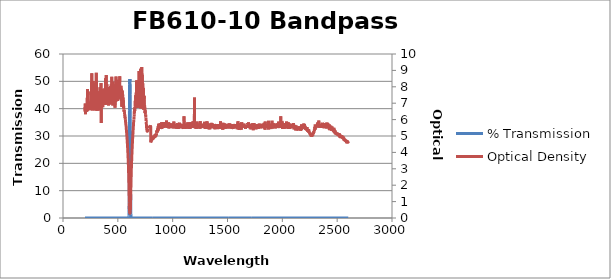
| Category | % Transmission |
|---|---|
| 2600.0 | 0.002 |
| 2599.0 | 0.002 |
| 2598.0 | 0.002 |
| 2597.0 | 0.003 |
| 2596.0 | 0.002 |
| 2595.0 | 0.002 |
| 2594.0 | 0.002 |
| 2593.0 | 0.002 |
| 2592.0 | 0.002 |
| 2591.0 | 0.002 |
| 2590.0 | 0.002 |
| 2589.0 | 0.002 |
| 2588.0 | 0.002 |
| 2587.0 | 0.002 |
| 2586.0 | 0.002 |
| 2585.0 | 0.002 |
| 2584.0 | 0.002 |
| 2583.0 | 0.002 |
| 2582.0 | 0.002 |
| 2581.0 | 0.002 |
| 2580.0 | 0.002 |
| 2579.0 | 0.002 |
| 2578.0 | 0.002 |
| 2577.0 | 0.002 |
| 2576.0 | 0.002 |
| 2575.0 | 0.002 |
| 2574.0 | 0.002 |
| 2573.0 | 0.002 |
| 2572.0 | 0.002 |
| 2571.0 | 0.002 |
| 2570.0 | 0.002 |
| 2569.0 | 0.002 |
| 2568.0 | 0.002 |
| 2567.0 | 0.002 |
| 2566.0 | 0.002 |
| 2565.0 | 0.002 |
| 2564.0 | 0.002 |
| 2563.0 | 0.001 |
| 2562.0 | 0.002 |
| 2561.0 | 0.002 |
| 2560.0 | 0.001 |
| 2559.0 | 0.001 |
| 2558.0 | 0.001 |
| 2557.0 | 0.001 |
| 2556.0 | 0.001 |
| 2555.0 | 0.002 |
| 2554.0 | 0.002 |
| 2553.0 | 0.001 |
| 2552.0 | 0.001 |
| 2551.0 | 0.001 |
| 2550.0 | 0.001 |
| 2549.0 | 0.001 |
| 2548.0 | 0.001 |
| 2547.0 | 0.001 |
| 2546.0 | 0.001 |
| 2545.0 | 0.001 |
| 2544.0 | 0.001 |
| 2543.0 | 0.001 |
| 2542.0 | 0.001 |
| 2541.0 | 0.001 |
| 2540.0 | 0.001 |
| 2539.0 | 0.001 |
| 2538.0 | 0.001 |
| 2537.0 | 0.001 |
| 2536.0 | 0.001 |
| 2535.0 | 0.001 |
| 2534.0 | 0.001 |
| 2533.0 | 0.001 |
| 2532.0 | 0.001 |
| 2531.0 | 0.001 |
| 2530.0 | 0.001 |
| 2529.0 | 0.001 |
| 2528.0 | 0.001 |
| 2527.0 | 0.001 |
| 2526.0 | 0.001 |
| 2525.0 | 0.001 |
| 2524.0 | 0.001 |
| 2523.0 | 0.001 |
| 2522.0 | 0.001 |
| 2521.0 | 0.001 |
| 2520.0 | 0.001 |
| 2519.0 | 0.001 |
| 2518.0 | 0.001 |
| 2517.0 | 0.001 |
| 2516.0 | 0.001 |
| 2515.0 | 0.001 |
| 2514.0 | 0.001 |
| 2513.0 | 0.001 |
| 2512.0 | 0.001 |
| 2511.0 | 0.001 |
| 2510.0 | 0.001 |
| 2509.0 | 0.001 |
| 2508.0 | 0.001 |
| 2507.0 | 0.001 |
| 2506.0 | 0.001 |
| 2505.0 | 0.001 |
| 2504.0 | 0.001 |
| 2503.0 | 0.001 |
| 2502.0 | 0.001 |
| 2501.0 | 0.001 |
| 2500.0 | 0.001 |
| 2499.0 | 0.001 |
| 2498.0 | 0.001 |
| 2497.0 | 0.001 |
| 2496.0 | 0.001 |
| 2495.0 | 0.001 |
| 2494.0 | 0.001 |
| 2493.0 | 0.001 |
| 2492.0 | 0.001 |
| 2491.0 | 0.001 |
| 2490.0 | 0.001 |
| 2489.0 | 0.001 |
| 2488.0 | 0.001 |
| 2487.0 | 0.001 |
| 2486.0 | 0.001 |
| 2485.0 | 0.001 |
| 2484.0 | 0.001 |
| 2483.0 | 0.001 |
| 2482.0 | 0.001 |
| 2481.0 | 0.001 |
| 2480.0 | 0 |
| 2479.0 | 0.001 |
| 2478.0 | 0.001 |
| 2477.0 | 0.001 |
| 2476.0 | 0.001 |
| 2475.0 | 0.001 |
| 2474.0 | 0 |
| 2473.0 | 0.001 |
| 2472.0 | 0 |
| 2471.0 | 0.001 |
| 2470.0 | 0 |
| 2469.0 | 0.001 |
| 2468.0 | 0 |
| 2467.0 | 0 |
| 2466.0 | 0 |
| 2465.0 | 0 |
| 2464.0 | 0 |
| 2463.0 | 0 |
| 2462.0 | 0.001 |
| 2461.0 | 0 |
| 2460.0 | 0 |
| 2459.0 | 0 |
| 2458.0 | 0 |
| 2457.0 | 0 |
| 2456.0 | 0 |
| 2455.0 | 0 |
| 2454.0 | 0 |
| 2453.0 | 0 |
| 2452.0 | 0 |
| 2451.0 | 0 |
| 2450.0 | 0 |
| 2449.0 | 0 |
| 2448.0 | 0 |
| 2447.0 | 0 |
| 2446.0 | 0 |
| 2445.0 | 0 |
| 2444.0 | 0 |
| 2443.0 | 0 |
| 2442.0 | 0 |
| 2441.0 | 0 |
| 2440.0 | 0 |
| 2439.0 | 0 |
| 2438.0 | 0 |
| 2437.0 | 0 |
| 2436.0 | 0 |
| 2435.0 | 0 |
| 2434.0 | 0 |
| 2433.0 | 0 |
| 2432.0 | 0 |
| 2431.0 | 0 |
| 2430.0 | 0 |
| 2429.0 | 0 |
| 2428.0 | 0 |
| 2427.0 | 0 |
| 2426.0 | 0 |
| 2425.0 | 0 |
| 2424.0 | 0 |
| 2423.0 | 0 |
| 2422.0 | 0 |
| 2421.0 | 0 |
| 2420.0 | 0 |
| 2419.0 | 0 |
| 2418.0 | 0 |
| 2417.0 | 0 |
| 2416.0 | 0 |
| 2415.0 | 0 |
| 2414.0 | 0 |
| 2413.0 | 0 |
| 2412.0 | 0 |
| 2411.0 | 0 |
| 2410.0 | 0 |
| 2409.0 | 0 |
| 2408.0 | 0 |
| 2407.0 | 0 |
| 2406.0 | 0 |
| 2405.0 | 0 |
| 2404.0 | 0 |
| 2403.0 | 0 |
| 2402.0 | 0 |
| 2401.0 | 0 |
| 2400.0 | 0 |
| 2399.0 | 0 |
| 2398.0 | 0 |
| 2397.0 | 0 |
| 2396.0 | 0 |
| 2395.0 | 0 |
| 2394.0 | 0 |
| 2393.0 | 0 |
| 2392.0 | 0 |
| 2391.0 | 0 |
| 2390.0 | 0 |
| 2389.0 | 0 |
| 2388.0 | 0 |
| 2387.0 | 0 |
| 2386.0 | 0 |
| 2385.0 | 0 |
| 2384.0 | 0 |
| 2383.0 | 0 |
| 2382.0 | 0 |
| 2381.0 | 0 |
| 2380.0 | 0 |
| 2379.0 | 0 |
| 2378.0 | 0 |
| 2377.0 | 0 |
| 2376.0 | 0 |
| 2375.0 | 0 |
| 2374.0 | 0 |
| 2373.0 | 0 |
| 2372.0 | 0 |
| 2371.0 | 0 |
| 2370.0 | 0 |
| 2369.0 | 0 |
| 2368.0 | 0 |
| 2367.0 | 0 |
| 2366.0 | 0 |
| 2365.0 | 0 |
| 2364.0 | 0 |
| 2363.0 | 0 |
| 2362.0 | 0 |
| 2361.0 | 0 |
| 2360.0 | 0 |
| 2359.0 | 0 |
| 2358.0 | 0 |
| 2357.0 | 0 |
| 2356.0 | 0 |
| 2355.0 | 0 |
| 2354.0 | 0 |
| 2353.0 | 0 |
| 2352.0 | 0 |
| 2351.0 | 0 |
| 2350.0 | 0 |
| 2349.0 | 0 |
| 2348.0 | 0 |
| 2347.0 | 0 |
| 2346.0 | 0 |
| 2345.0 | 0 |
| 2344.0 | 0 |
| 2343.0 | 0 |
| 2342.0 | 0 |
| 2341.0 | 0 |
| 2340.0 | 0 |
| 2339.0 | 0 |
| 2338.0 | 0 |
| 2337.0 | 0 |
| 2336.0 | 0 |
| 2335.0 | 0 |
| 2334.0 | 0 |
| 2333.0 | 0 |
| 2332.0 | 0 |
| 2331.0 | 0 |
| 2330.0 | 0 |
| 2329.0 | 0 |
| 2328.0 | 0 |
| 2327.0 | 0 |
| 2326.0 | 0 |
| 2325.0 | 0 |
| 2324.0 | 0 |
| 2323.0 | 0 |
| 2322.0 | 0 |
| 2321.0 | 0 |
| 2320.0 | 0 |
| 2319.0 | 0 |
| 2318.0 | 0 |
| 2317.0 | 0 |
| 2316.0 | 0 |
| 2315.0 | 0 |
| 2314.0 | 0 |
| 2313.0 | 0 |
| 2312.0 | 0 |
| 2311.0 | 0 |
| 2310.0 | 0 |
| 2309.0 | 0 |
| 2308.0 | 0 |
| 2307.0 | 0 |
| 2306.0 | 0 |
| 2305.0 | 0 |
| 2304.0 | 0 |
| 2303.0 | 0 |
| 2302.0 | 0 |
| 2301.0 | 0 |
| 2300.0 | 0 |
| 2299.0 | 0 |
| 2298.0 | 0 |
| 2297.0 | 0 |
| 2296.0 | 0 |
| 2295.0 | 0 |
| 2294.0 | 0 |
| 2293.0 | 0 |
| 2292.0 | 0 |
| 2291.0 | 0 |
| 2290.0 | 0.001 |
| 2289.0 | 0.001 |
| 2288.0 | 0.001 |
| 2287.0 | 0 |
| 2286.0 | 0.001 |
| 2285.0 | 0.001 |
| 2284.0 | 0.001 |
| 2283.0 | 0.001 |
| 2282.0 | 0.001 |
| 2281.0 | 0.001 |
| 2280.0 | 0.001 |
| 2279.0 | 0.001 |
| 2278.0 | 0.001 |
| 2277.0 | 0.001 |
| 2276.0 | 0.001 |
| 2275.0 | 0.001 |
| 2274.0 | 0.001 |
| 2273.0 | 0.001 |
| 2272.0 | 0.001 |
| 2271.0 | 0.001 |
| 2270.0 | 0.001 |
| 2269.0 | 0.001 |
| 2268.0 | 0.001 |
| 2267.0 | 0.001 |
| 2266.0 | 0.001 |
| 2265.0 | 0.001 |
| 2264.0 | 0.001 |
| 2263.0 | 0.001 |
| 2262.0 | 0.001 |
| 2261.0 | 0.001 |
| 2260.0 | 0.001 |
| 2259.0 | 0.001 |
| 2258.0 | 0.001 |
| 2257.0 | 0.001 |
| 2256.0 | 0.001 |
| 2255.0 | 0.001 |
| 2254.0 | 0.001 |
| 2253.0 | 0.001 |
| 2252.0 | 0.001 |
| 2251.0 | 0.001 |
| 2250.0 | 0.001 |
| 2249.0 | 0.001 |
| 2248.0 | 0.001 |
| 2247.0 | 0.001 |
| 2246.0 | 0.001 |
| 2245.0 | 0.001 |
| 2244.0 | 0.001 |
| 2243.0 | 0.001 |
| 2242.0 | 0.001 |
| 2241.0 | 0 |
| 2240.0 | 0 |
| 2239.0 | 0.001 |
| 2238.0 | 0.001 |
| 2237.0 | 0.001 |
| 2236.0 | 0 |
| 2235.0 | 0 |
| 2234.0 | 0.001 |
| 2233.0 | 0 |
| 2232.0 | 0 |
| 2231.0 | 0 |
| 2230.0 | 0 |
| 2229.0 | 0 |
| 2228.0 | 0 |
| 2227.0 | 0 |
| 2226.0 | 0 |
| 2225.0 | 0 |
| 2224.0 | 0 |
| 2223.0 | 0 |
| 2222.0 | 0 |
| 2221.0 | 0 |
| 2220.0 | 0 |
| 2219.0 | 0 |
| 2218.0 | 0 |
| 2217.0 | 0 |
| 2216.0 | 0 |
| 2215.0 | 0 |
| 2214.0 | 0 |
| 2213.0 | 0 |
| 2212.0 | 0 |
| 2211.0 | 0 |
| 2210.0 | 0 |
| 2209.0 | 0 |
| 2208.0 | 0 |
| 2207.0 | 0 |
| 2206.0 | 0 |
| 2205.0 | 0 |
| 2204.0 | 0 |
| 2203.0 | 0 |
| 2202.0 | 0 |
| 2201.0 | 0 |
| 2200.0 | 0 |
| 2199.0 | 0 |
| 2198.0 | 0 |
| 2197.0 | 0 |
| 2196.0 | 0 |
| 2195.0 | 0 |
| 2194.0 | 0 |
| 2193.0 | 0 |
| 2192.0 | 0 |
| 2191.0 | 0 |
| 2190.0 | 0 |
| 2189.0 | 0 |
| 2188.0 | 0 |
| 2187.0 | 0 |
| 2186.0 | 0 |
| 2185.0 | 0 |
| 2184.0 | 0 |
| 2183.0 | 0 |
| 2182.0 | 0 |
| 2181.0 | 0 |
| 2180.0 | 0 |
| 2179.0 | 0 |
| 2178.0 | 0 |
| 2177.0 | 0 |
| 2176.0 | 0 |
| 2175.0 | 0 |
| 2174.0 | 0 |
| 2173.0 | 0 |
| 2172.0 | 0 |
| 2171.0 | 0 |
| 2170.0 | 0 |
| 2169.0 | 0 |
| 2168.0 | 0 |
| 2167.0 | 0 |
| 2166.0 | 0 |
| 2165.0 | 0 |
| 2164.0 | 0 |
| 2163.0 | 0 |
| 2162.0 | 0 |
| 2161.0 | 0 |
| 2160.0 | 0 |
| 2159.0 | 0 |
| 2158.0 | 0 |
| 2157.0 | 0 |
| 2156.0 | 0 |
| 2155.0 | 0 |
| 2154.0 | 0 |
| 2153.0 | 0 |
| 2152.0 | 0 |
| 2151.0 | 0 |
| 2150.0 | 0 |
| 2149.0 | 0 |
| 2148.0 | 0 |
| 2147.0 | 0 |
| 2146.0 | 0 |
| 2145.0 | 0 |
| 2144.0 | 0 |
| 2143.0 | 0 |
| 2142.0 | 0 |
| 2141.0 | 0 |
| 2140.0 | 0 |
| 2139.0 | 0 |
| 2138.0 | 0 |
| 2137.0 | 0 |
| 2136.0 | 0 |
| 2135.0 | 0 |
| 2134.0 | 0 |
| 2133.0 | 0 |
| 2132.0 | 0 |
| 2131.0 | 0 |
| 2130.0 | 0 |
| 2129.0 | 0 |
| 2128.0 | 0 |
| 2127.0 | 0 |
| 2126.0 | 0 |
| 2125.0 | 0 |
| 2124.0 | 0 |
| 2123.0 | 0 |
| 2122.0 | 0 |
| 2121.0 | 0 |
| 2120.0 | 0 |
| 2119.0 | 0 |
| 2118.0 | 0 |
| 2117.0 | 0 |
| 2116.0 | 0 |
| 2115.0 | 0 |
| 2114.0 | 0 |
| 2113.0 | 0 |
| 2112.0 | 0 |
| 2111.0 | 0 |
| 2110.0 | 0 |
| 2109.0 | 0 |
| 2108.0 | 0 |
| 2107.0 | 0 |
| 2106.0 | 0 |
| 2105.0 | 0 |
| 2104.0 | 0 |
| 2103.0 | 0 |
| 2102.0 | 0 |
| 2101.0 | 0 |
| 2100.0 | 0 |
| 2099.0 | 0 |
| 2098.0 | 0 |
| 2097.0 | 0 |
| 2096.0 | 0 |
| 2095.0 | 0 |
| 2094.0 | 0 |
| 2093.0 | 0 |
| 2092.0 | 0 |
| 2091.0 | 0 |
| 2090.0 | 0 |
| 2089.0 | 0 |
| 2088.0 | 0 |
| 2087.0 | 0 |
| 2086.0 | 0 |
| 2085.0 | 0 |
| 2084.0 | 0 |
| 2083.0 | 0 |
| 2082.0 | 0 |
| 2081.0 | 0 |
| 2080.0 | 0 |
| 2079.0 | 0 |
| 2078.0 | 0 |
| 2077.0 | 0 |
| 2076.0 | 0 |
| 2075.0 | 0 |
| 2074.0 | 0 |
| 2073.0 | 0 |
| 2072.0 | 0 |
| 2071.0 | 0 |
| 2070.0 | 0 |
| 2069.0 | 0 |
| 2068.0 | 0 |
| 2067.0 | 0 |
| 2066.0 | 0 |
| 2065.0 | 0 |
| 2064.0 | 0 |
| 2063.0 | 0 |
| 2062.0 | 0 |
| 2061.0 | 0 |
| 2060.0 | 0 |
| 2059.0 | 0 |
| 2058.0 | 0 |
| 2057.0 | 0 |
| 2056.0 | 0 |
| 2055.0 | 0 |
| 2054.0 | 0 |
| 2053.0 | 0 |
| 2052.0 | 0 |
| 2051.0 | 0 |
| 2050.0 | 0 |
| 2049.0 | 0 |
| 2048.0 | 0 |
| 2047.0 | 0 |
| 2046.0 | 0 |
| 2045.0 | 0 |
| 2044.0 | 0 |
| 2043.0 | 0 |
| 2042.0 | 0 |
| 2041.0 | 0 |
| 2040.0 | 0 |
| 2039.0 | 0 |
| 2038.0 | 0 |
| 2037.0 | 0 |
| 2036.0 | 0 |
| 2035.0 | 0 |
| 2034.0 | 0 |
| 2033.0 | 0 |
| 2032.0 | 0 |
| 2031.0 | 0 |
| 2030.0 | 0 |
| 2029.0 | 0 |
| 2028.0 | 0 |
| 2027.0 | 0 |
| 2026.0 | 0 |
| 2025.0 | 0 |
| 2024.0 | 0 |
| 2023.0 | 0 |
| 2022.0 | 0 |
| 2021.0 | 0 |
| 2020.0 | 0 |
| 2019.0 | 0 |
| 2018.0 | 0 |
| 2017.0 | 0 |
| 2016.0 | 0 |
| 2015.0 | 0 |
| 2014.0 | 0 |
| 2013.0 | 0 |
| 2012.0 | 0 |
| 2011.0 | 0 |
| 2010.0 | 0 |
| 2009.0 | 0 |
| 2008.0 | 0 |
| 2007.0 | 0 |
| 2006.0 | 0 |
| 2005.0 | 0 |
| 2004.0 | 0 |
| 2003.0 | 0 |
| 2002.0 | 0 |
| 2001.0 | 0 |
| 2000.0 | 0 |
| 1999.0 | 0 |
| 1998.0 | 0 |
| 1997.0 | 0 |
| 1996.0 | 0 |
| 1995.0 | 0 |
| 1994.0 | 0 |
| 1993.0 | 0 |
| 1992.0 | 0 |
| 1991.0 | 0 |
| 1990.0 | 0 |
| 1989.0 | 0 |
| 1988.0 | 0 |
| 1987.0 | 0 |
| 1986.0 | 0 |
| 1985.0 | 0 |
| 1984.0 | 0 |
| 1983.0 | 0 |
| 1982.0 | 0 |
| 1981.0 | 0 |
| 1980.0 | 0 |
| 1979.0 | 0 |
| 1978.0 | 0 |
| 1977.0 | 0 |
| 1976.0 | 0 |
| 1975.0 | 0 |
| 1974.0 | 0 |
| 1973.0 | 0 |
| 1972.0 | 0 |
| 1971.0 | 0 |
| 1970.0 | 0 |
| 1969.0 | 0 |
| 1968.0 | 0 |
| 1967.0 | 0 |
| 1966.0 | 0 |
| 1965.0 | 0 |
| 1964.0 | 0 |
| 1963.0 | 0 |
| 1962.0 | 0 |
| 1961.0 | 0 |
| 1960.0 | 0 |
| 1959.0 | 0 |
| 1958.0 | 0 |
| 1957.0 | 0 |
| 1956.0 | 0 |
| 1955.0 | 0 |
| 1954.0 | 0 |
| 1953.0 | 0 |
| 1952.0 | 0 |
| 1951.0 | 0 |
| 1950.0 | 0 |
| 1949.0 | 0 |
| 1948.0 | 0 |
| 1947.0 | 0 |
| 1946.0 | 0 |
| 1945.0 | 0 |
| 1944.0 | 0 |
| 1943.0 | 0 |
| 1942.0 | 0 |
| 1941.0 | 0 |
| 1940.0 | 0 |
| 1939.0 | 0 |
| 1938.0 | 0 |
| 1937.0 | 0 |
| 1936.0 | 0 |
| 1935.0 | 0 |
| 1934.0 | 0 |
| 1933.0 | 0 |
| 1932.0 | 0 |
| 1931.0 | 0 |
| 1930.0 | 0 |
| 1929.0 | 0 |
| 1928.0 | 0 |
| 1927.0 | 0 |
| 1926.0 | 0 |
| 1925.0 | 0 |
| 1924.0 | 0 |
| 1923.0 | 0 |
| 1922.0 | 0 |
| 1921.0 | 0 |
| 1920.0 | 0 |
| 1919.0 | 0 |
| 1918.0 | 0 |
| 1917.0 | 0 |
| 1916.0 | 0 |
| 1915.0 | 0 |
| 1914.0 | 0 |
| 1913.0 | 0 |
| 1912.0 | 0 |
| 1911.0 | 0 |
| 1910.0 | 0 |
| 1909.0 | 0 |
| 1908.0 | 0 |
| 1907.0 | 0 |
| 1906.0 | 0 |
| 1905.0 | 0 |
| 1904.0 | 0 |
| 1903.0 | 0 |
| 1902.0 | 0 |
| 1901.0 | 0 |
| 1900.0 | 0 |
| 1899.0 | 0 |
| 1898.0 | 0 |
| 1897.0 | 0 |
| 1896.0 | 0 |
| 1895.0 | 0 |
| 1894.0 | 0 |
| 1893.0 | 0 |
| 1892.0 | 0 |
| 1891.0 | 0 |
| 1890.0 | 0 |
| 1889.0 | 0 |
| 1888.0 | 0 |
| 1887.0 | 0 |
| 1886.0 | 0 |
| 1885.0 | 0 |
| 1884.0 | 0 |
| 1883.0 | 0 |
| 1882.0 | 0 |
| 1881.0 | 0 |
| 1880.0 | 0 |
| 1879.0 | 0 |
| 1878.0 | 0 |
| 1877.0 | 0 |
| 1876.0 | 0 |
| 1875.0 | 0 |
| 1874.0 | 0 |
| 1873.0 | 0 |
| 1872.0 | 0 |
| 1871.0 | 0 |
| 1870.0 | 0 |
| 1869.0 | 0 |
| 1868.0 | 0 |
| 1867.0 | 0 |
| 1866.0 | 0 |
| 1865.0 | 0 |
| 1864.0 | 0 |
| 1863.0 | 0 |
| 1862.0 | 0 |
| 1861.0 | 0 |
| 1860.0 | 0 |
| 1859.0 | 0 |
| 1858.0 | 0 |
| 1857.0 | 0 |
| 1856.0 | 0 |
| 1855.0 | 0 |
| 1854.0 | 0 |
| 1853.0 | 0 |
| 1852.0 | 0 |
| 1851.0 | 0 |
| 1850.0 | 0 |
| 1849.0 | 0 |
| 1848.0 | 0 |
| 1847.0 | 0 |
| 1846.0 | 0 |
| 1845.0 | 0 |
| 1844.0 | 0 |
| 1843.0 | 0 |
| 1842.0 | 0 |
| 1841.0 | 0 |
| 1840.0 | 0 |
| 1839.0 | 0 |
| 1838.0 | 0 |
| 1837.0 | 0 |
| 1836.0 | 0 |
| 1835.0 | 0 |
| 1834.0 | 0 |
| 1833.0 | 0 |
| 1832.0 | 0 |
| 1831.0 | 0 |
| 1830.0 | 0 |
| 1829.0 | 0 |
| 1828.0 | 0 |
| 1827.0 | 0 |
| 1826.0 | 0 |
| 1825.0 | 0 |
| 1824.0 | 0 |
| 1823.0 | 0 |
| 1822.0 | 0 |
| 1821.0 | 0 |
| 1820.0 | 0 |
| 1819.0 | 0 |
| 1818.0 | 0 |
| 1817.0 | 0 |
| 1816.0 | 0 |
| 1815.0 | 0 |
| 1814.0 | 0 |
| 1813.0 | 0 |
| 1812.0 | 0 |
| 1811.0 | 0 |
| 1810.0 | 0 |
| 1809.0 | 0 |
| 1808.0 | 0 |
| 1807.0 | 0 |
| 1806.0 | 0 |
| 1805.0 | 0 |
| 1804.0 | 0 |
| 1803.0 | 0 |
| 1802.0 | 0 |
| 1801.0 | 0 |
| 1800.0 | 0 |
| 1799.0 | 0 |
| 1798.0 | 0 |
| 1797.0 | 0 |
| 1796.0 | 0 |
| 1795.0 | 0 |
| 1794.0 | 0 |
| 1793.0 | 0 |
| 1792.0 | 0 |
| 1791.0 | 0 |
| 1790.0 | 0 |
| 1789.0 | 0 |
| 1788.0 | 0 |
| 1787.0 | 0 |
| 1786.0 | 0 |
| 1785.0 | 0 |
| 1784.0 | 0 |
| 1783.0 | 0 |
| 1782.0 | 0 |
| 1781.0 | 0 |
| 1780.0 | 0 |
| 1779.0 | 0 |
| 1778.0 | 0 |
| 1777.0 | 0 |
| 1776.0 | 0 |
| 1775.0 | 0 |
| 1774.0 | 0 |
| 1773.0 | 0 |
| 1772.0 | 0 |
| 1771.0 | 0 |
| 1770.0 | 0 |
| 1769.0 | 0 |
| 1768.0 | 0 |
| 1767.0 | 0 |
| 1766.0 | 0 |
| 1765.0 | 0 |
| 1764.0 | 0 |
| 1763.0 | 0 |
| 1762.0 | 0 |
| 1761.0 | 0 |
| 1760.0 | 0 |
| 1759.0 | 0 |
| 1758.0 | 0 |
| 1757.0 | 0 |
| 1756.0 | 0 |
| 1755.0 | 0 |
| 1754.0 | 0 |
| 1753.0 | 0 |
| 1752.0 | 0 |
| 1751.0 | 0 |
| 1750.0 | 0 |
| 1749.0 | 0 |
| 1748.0 | 0 |
| 1747.0 | 0 |
| 1746.0 | 0 |
| 1745.0 | 0 |
| 1744.0 | 0 |
| 1743.0 | 0 |
| 1742.0 | 0 |
| 1741.0 | 0 |
| 1740.0 | 0 |
| 1739.0 | 0 |
| 1738.0 | 0 |
| 1737.0 | 0 |
| 1736.0 | 0 |
| 1735.0 | 0 |
| 1734.0 | 0 |
| 1733.0 | 0 |
| 1732.0 | 0 |
| 1731.0 | 0 |
| 1730.0 | 0 |
| 1729.0 | 0 |
| 1728.0 | 0 |
| 1727.0 | 0 |
| 1726.0 | 0 |
| 1725.0 | 0 |
| 1724.0 | 0 |
| 1723.0 | 0 |
| 1722.0 | 0 |
| 1721.0 | 0 |
| 1720.0 | 0 |
| 1719.0 | 0 |
| 1718.0 | 0 |
| 1717.0 | 0 |
| 1716.0 | 0 |
| 1715.0 | 0 |
| 1714.0 | 0 |
| 1713.0 | 0 |
| 1712.0 | 0 |
| 1711.0 | 0 |
| 1710.0 | 0 |
| 1709.0 | 0 |
| 1708.0 | 0 |
| 1707.0 | 0 |
| 1706.0 | 0 |
| 1705.0 | 0 |
| 1704.0 | 0 |
| 1703.0 | 0 |
| 1702.0 | 0 |
| 1701.0 | 0 |
| 1700.0 | 0 |
| 1699.0 | 0 |
| 1698.0 | 0 |
| 1697.0 | 0 |
| 1696.0 | 0 |
| 1695.0 | 0 |
| 1694.0 | 0 |
| 1693.0 | 0 |
| 1692.0 | 0 |
| 1691.0 | 0 |
| 1690.0 | 0 |
| 1689.0 | 0 |
| 1688.0 | 0 |
| 1687.0 | 0 |
| 1686.0 | 0 |
| 1685.0 | 0 |
| 1684.0 | 0 |
| 1683.0 | 0 |
| 1682.0 | 0 |
| 1681.0 | 0 |
| 1680.0 | 0 |
| 1679.0 | 0 |
| 1678.0 | 0 |
| 1677.0 | 0 |
| 1676.0 | 0 |
| 1675.0 | 0 |
| 1674.0 | 0 |
| 1673.0 | 0 |
| 1672.0 | 0 |
| 1671.0 | 0 |
| 1670.0 | 0 |
| 1669.0 | 0 |
| 1668.0 | 0 |
| 1667.0 | 0 |
| 1666.0 | 0 |
| 1665.0 | 0 |
| 1664.0 | 0 |
| 1663.0 | 0 |
| 1662.0 | 0 |
| 1661.0 | 0 |
| 1660.0 | 0 |
| 1659.0 | 0 |
| 1658.0 | 0 |
| 1657.0 | 0 |
| 1656.0 | 0 |
| 1655.0 | 0 |
| 1654.0 | 0 |
| 1653.0 | 0 |
| 1652.0 | 0 |
| 1651.0 | 0 |
| 1650.0 | 0 |
| 1649.0 | 0 |
| 1648.0 | 0 |
| 1647.0 | 0 |
| 1646.0 | 0 |
| 1645.0 | 0 |
| 1644.0 | 0 |
| 1643.0 | 0 |
| 1642.0 | 0 |
| 1641.0 | 0 |
| 1640.0 | 0 |
| 1639.0 | 0 |
| 1638.0 | 0 |
| 1637.0 | 0 |
| 1636.0 | 0 |
| 1635.0 | 0 |
| 1634.0 | 0 |
| 1633.0 | 0 |
| 1632.0 | 0 |
| 1631.0 | 0 |
| 1630.0 | 0 |
| 1629.0 | 0 |
| 1628.0 | 0 |
| 1627.0 | 0 |
| 1626.0 | 0 |
| 1625.0 | 0 |
| 1624.0 | 0 |
| 1623.0 | 0 |
| 1622.0 | 0 |
| 1621.0 | 0 |
| 1620.0 | 0 |
| 1619.0 | 0 |
| 1618.0 | 0 |
| 1617.0 | 0 |
| 1616.0 | 0 |
| 1615.0 | 0 |
| 1614.0 | 0 |
| 1613.0 | 0 |
| 1612.0 | 0 |
| 1611.0 | 0 |
| 1610.0 | 0 |
| 1609.0 | 0 |
| 1608.0 | 0 |
| 1607.0 | 0 |
| 1606.0 | 0 |
| 1605.0 | 0 |
| 1604.0 | 0 |
| 1603.0 | 0 |
| 1602.0 | 0 |
| 1601.0 | 0 |
| 1600.0 | 0 |
| 1599.0 | 0 |
| 1598.0 | 0 |
| 1597.0 | 0 |
| 1596.0 | 0 |
| 1595.0 | 0 |
| 1594.0 | 0 |
| 1593.0 | 0 |
| 1592.0 | 0 |
| 1591.0 | 0 |
| 1590.0 | 0 |
| 1589.0 | 0 |
| 1588.0 | 0 |
| 1587.0 | 0 |
| 1586.0 | 0 |
| 1585.0 | 0 |
| 1584.0 | 0 |
| 1583.0 | 0 |
| 1582.0 | 0 |
| 1581.0 | 0 |
| 1580.0 | 0 |
| 1579.0 | 0 |
| 1578.0 | 0 |
| 1577.0 | 0 |
| 1576.0 | 0 |
| 1575.0 | 0 |
| 1574.0 | 0 |
| 1573.0 | 0 |
| 1572.0 | 0 |
| 1571.0 | 0 |
| 1570.0 | 0 |
| 1569.0 | 0 |
| 1568.0 | 0 |
| 1567.0 | 0 |
| 1566.0 | 0 |
| 1565.0 | 0 |
| 1564.0 | 0 |
| 1563.0 | 0 |
| 1562.0 | 0 |
| 1561.0 | 0 |
| 1560.0 | 0 |
| 1559.0 | 0 |
| 1558.0 | 0 |
| 1557.0 | 0 |
| 1556.0 | 0 |
| 1555.0 | 0 |
| 1554.0 | 0 |
| 1553.0 | 0 |
| 1552.0 | 0 |
| 1551.0 | 0 |
| 1550.0 | 0 |
| 1549.0 | 0 |
| 1548.0 | 0 |
| 1547.0 | 0 |
| 1546.0 | 0 |
| 1545.0 | 0 |
| 1544.0 | 0 |
| 1543.0 | 0 |
| 1542.0 | 0 |
| 1541.0 | 0 |
| 1540.0 | 0 |
| 1539.0 | 0 |
| 1538.0 | 0 |
| 1537.0 | 0 |
| 1536.0 | 0 |
| 1535.0 | 0 |
| 1534.0 | 0 |
| 1533.0 | 0 |
| 1532.0 | 0 |
| 1531.0 | 0 |
| 1530.0 | 0 |
| 1529.0 | 0 |
| 1528.0 | 0 |
| 1527.0 | 0 |
| 1526.0 | 0 |
| 1525.0 | 0 |
| 1524.0 | 0 |
| 1523.0 | 0 |
| 1522.0 | 0 |
| 1521.0 | 0 |
| 1520.0 | 0 |
| 1519.0 | 0 |
| 1518.0 | 0 |
| 1517.0 | 0 |
| 1516.0 | 0 |
| 1515.0 | 0 |
| 1514.0 | 0 |
| 1513.0 | 0 |
| 1512.0 | 0 |
| 1511.0 | 0 |
| 1510.0 | 0 |
| 1509.0 | 0 |
| 1508.0 | 0 |
| 1507.0 | 0 |
| 1506.0 | 0 |
| 1505.0 | 0 |
| 1504.0 | 0 |
| 1503.0 | 0 |
| 1502.0 | 0 |
| 1501.0 | 0 |
| 1500.0 | 0 |
| 1499.0 | 0 |
| 1498.0 | 0 |
| 1497.0 | 0 |
| 1496.0 | 0 |
| 1495.0 | 0 |
| 1494.0 | 0 |
| 1493.0 | 0 |
| 1492.0 | 0 |
| 1491.0 | 0 |
| 1490.0 | 0 |
| 1489.0 | 0 |
| 1488.0 | 0 |
| 1487.0 | 0 |
| 1486.0 | 0 |
| 1485.0 | 0 |
| 1484.0 | 0 |
| 1483.0 | 0 |
| 1482.0 | 0 |
| 1481.0 | 0 |
| 1480.0 | 0 |
| 1479.0 | 0 |
| 1478.0 | 0 |
| 1477.0 | 0 |
| 1476.0 | 0 |
| 1475.0 | 0 |
| 1474.0 | 0 |
| 1473.0 | 0 |
| 1472.0 | 0 |
| 1471.0 | 0 |
| 1470.0 | 0 |
| 1469.0 | 0 |
| 1468.0 | 0 |
| 1467.0 | 0 |
| 1466.0 | 0 |
| 1465.0 | 0 |
| 1464.0 | 0 |
| 1463.0 | 0 |
| 1462.0 | 0 |
| 1461.0 | 0 |
| 1460.0 | 0 |
| 1459.0 | 0 |
| 1458.0 | 0 |
| 1457.0 | 0 |
| 1456.0 | 0 |
| 1455.0 | 0 |
| 1454.0 | 0 |
| 1453.0 | 0 |
| 1452.0 | 0 |
| 1451.0 | 0 |
| 1450.0 | 0 |
| 1449.0 | 0 |
| 1448.0 | 0 |
| 1447.0 | 0 |
| 1446.0 | 0 |
| 1445.0 | 0 |
| 1444.0 | 0 |
| 1443.0 | 0 |
| 1442.0 | 0 |
| 1441.0 | 0 |
| 1440.0 | 0 |
| 1439.0 | 0 |
| 1438.0 | 0 |
| 1437.0 | 0 |
| 1436.0 | 0 |
| 1435.0 | 0 |
| 1434.0 | 0 |
| 1433.0 | 0 |
| 1432.0 | 0 |
| 1431.0 | 0 |
| 1430.0 | 0 |
| 1429.0 | 0 |
| 1428.0 | 0 |
| 1427.0 | 0 |
| 1426.0 | 0 |
| 1425.0 | 0 |
| 1424.0 | 0 |
| 1423.0 | 0 |
| 1422.0 | 0 |
| 1421.0 | 0 |
| 1420.0 | 0 |
| 1419.0 | 0 |
| 1418.0 | 0 |
| 1417.0 | 0 |
| 1416.0 | 0 |
| 1415.0 | 0 |
| 1414.0 | 0 |
| 1413.0 | 0 |
| 1412.0 | 0 |
| 1411.0 | 0 |
| 1410.0 | 0 |
| 1409.0 | 0 |
| 1408.0 | 0 |
| 1407.0 | 0 |
| 1406.0 | 0 |
| 1405.0 | 0 |
| 1404.0 | 0 |
| 1403.0 | 0 |
| 1402.0 | 0 |
| 1401.0 | 0 |
| 1400.0 | 0 |
| 1399.0 | 0 |
| 1398.0 | 0 |
| 1397.0 | 0 |
| 1396.0 | 0 |
| 1395.0 | 0 |
| 1394.0 | 0 |
| 1393.0 | 0 |
| 1392.0 | 0 |
| 1391.0 | 0 |
| 1390.0 | 0 |
| 1389.0 | 0 |
| 1388.0 | 0 |
| 1387.0 | 0 |
| 1386.0 | 0 |
| 1385.0 | 0 |
| 1384.0 | 0 |
| 1383.0 | 0 |
| 1382.0 | 0 |
| 1381.0 | 0 |
| 1380.0 | 0 |
| 1379.0 | 0 |
| 1378.0 | 0 |
| 1377.0 | 0 |
| 1376.0 | 0 |
| 1375.0 | 0 |
| 1374.0 | 0 |
| 1373.0 | 0 |
| 1372.0 | 0 |
| 1371.0 | 0 |
| 1370.0 | 0 |
| 1369.0 | 0 |
| 1368.0 | 0 |
| 1367.0 | 0 |
| 1366.0 | 0 |
| 1365.0 | 0 |
| 1364.0 | 0 |
| 1363.0 | 0 |
| 1362.0 | 0 |
| 1361.0 | 0 |
| 1360.0 | 0 |
| 1359.0 | 0 |
| 1358.0 | 0 |
| 1357.0 | 0 |
| 1356.0 | 0 |
| 1355.0 | 0 |
| 1354.0 | 0 |
| 1353.0 | 0 |
| 1352.0 | 0 |
| 1351.0 | 0 |
| 1350.0 | 0 |
| 1349.0 | 0 |
| 1348.0 | 0 |
| 1347.0 | 0 |
| 1346.0 | 0 |
| 1345.0 | 0 |
| 1344.0 | 0 |
| 1343.0 | 0 |
| 1342.0 | 0 |
| 1341.0 | 0 |
| 1340.0 | 0 |
| 1339.0 | 0 |
| 1338.0 | 0 |
| 1337.0 | 0 |
| 1336.0 | 0 |
| 1335.0 | 0 |
| 1334.0 | 0 |
| 1333.0 | 0 |
| 1332.0 | 0 |
| 1331.0 | 0 |
| 1330.0 | 0 |
| 1329.0 | 0 |
| 1328.0 | 0 |
| 1327.0 | 0 |
| 1326.0 | 0 |
| 1325.0 | 0 |
| 1324.0 | 0 |
| 1323.0 | 0 |
| 1322.0 | 0 |
| 1321.0 | 0 |
| 1320.0 | 0 |
| 1319.0 | 0 |
| 1318.0 | 0 |
| 1317.0 | 0 |
| 1316.0 | 0 |
| 1315.0 | 0 |
| 1314.0 | 0 |
| 1313.0 | 0 |
| 1312.0 | 0 |
| 1311.0 | 0 |
| 1310.0 | 0 |
| 1309.0 | 0 |
| 1308.0 | 0 |
| 1307.0 | 0 |
| 1306.0 | 0 |
| 1305.0 | 0 |
| 1304.0 | 0 |
| 1303.0 | 0 |
| 1302.0 | 0 |
| 1301.0 | 0 |
| 1300.0 | 0 |
| 1299.0 | 0 |
| 1298.0 | 0 |
| 1297.0 | 0 |
| 1296.0 | 0 |
| 1295.0 | 0 |
| 1294.0 | 0 |
| 1293.0 | 0 |
| 1292.0 | 0 |
| 1291.0 | 0 |
| 1290.0 | 0 |
| 1289.0 | 0 |
| 1288.0 | 0 |
| 1287.0 | 0 |
| 1286.0 | 0 |
| 1285.0 | 0 |
| 1284.0 | 0 |
| 1283.0 | 0 |
| 1282.0 | 0 |
| 1281.0 | 0 |
| 1280.0 | 0 |
| 1279.0 | 0 |
| 1278.0 | 0 |
| 1277.0 | 0 |
| 1276.0 | 0 |
| 1275.0 | 0 |
| 1274.0 | 0 |
| 1273.0 | 0 |
| 1272.0 | 0 |
| 1271.0 | 0 |
| 1270.0 | 0 |
| 1269.0 | 0 |
| 1268.0 | 0 |
| 1267.0 | 0 |
| 1266.0 | 0 |
| 1265.0 | 0 |
| 1264.0 | 0 |
| 1263.0 | 0 |
| 1262.0 | 0 |
| 1261.0 | 0 |
| 1260.0 | 0 |
| 1259.0 | 0 |
| 1258.0 | 0 |
| 1257.0 | 0 |
| 1256.0 | 0 |
| 1255.0 | 0 |
| 1254.0 | 0 |
| 1253.0 | 0 |
| 1252.0 | 0 |
| 1251.0 | 0 |
| 1250.0 | 0 |
| 1249.0 | 0 |
| 1248.0 | 0 |
| 1247.0 | 0 |
| 1246.0 | 0 |
| 1245.0 | 0 |
| 1244.0 | 0 |
| 1243.0 | 0 |
| 1242.0 | 0 |
| 1241.0 | 0 |
| 1240.0 | 0 |
| 1239.0 | 0 |
| 1238.0 | 0 |
| 1237.0 | 0 |
| 1236.0 | 0 |
| 1235.0 | 0 |
| 1234.0 | 0 |
| 1233.0 | 0 |
| 1232.0 | 0 |
| 1231.0 | 0 |
| 1230.0 | 0 |
| 1229.0 | 0 |
| 1228.0 | 0 |
| 1227.0 | 0 |
| 1226.0 | 0 |
| 1225.0 | 0 |
| 1224.0 | 0 |
| 1223.0 | 0 |
| 1222.0 | 0 |
| 1221.0 | 0 |
| 1220.0 | 0 |
| 1219.0 | 0 |
| 1218.0 | 0 |
| 1217.0 | 0 |
| 1216.0 | 0 |
| 1215.0 | 0 |
| 1214.0 | 0 |
| 1213.0 | 0 |
| 1212.0 | 0 |
| 1211.0 | 0 |
| 1210.0 | 0 |
| 1209.0 | 0 |
| 1208.0 | 0 |
| 1207.0 | 0 |
| 1206.0 | 0 |
| 1205.0 | 0 |
| 1204.0 | 0 |
| 1203.0 | 0 |
| 1202.0 | 0 |
| 1201.0 | 0 |
| 1200.0 | 0 |
| 1199.0 | 0 |
| 1198.0 | 0 |
| 1197.0 | 0 |
| 1196.0 | 0 |
| 1195.0 | 0 |
| 1194.0 | 0 |
| 1193.0 | 0 |
| 1192.0 | 0 |
| 1191.0 | 0 |
| 1190.0 | 0 |
| 1189.0 | 0 |
| 1188.0 | 0 |
| 1187.0 | 0 |
| 1186.0 | 0 |
| 1185.0 | 0 |
| 1184.0 | 0 |
| 1183.0 | 0 |
| 1182.0 | 0 |
| 1181.0 | 0 |
| 1180.0 | 0 |
| 1179.0 | 0 |
| 1178.0 | 0 |
| 1177.0 | 0 |
| 1176.0 | 0 |
| 1175.0 | 0 |
| 1174.0 | 0 |
| 1173.0 | 0 |
| 1172.0 | 0 |
| 1171.0 | 0 |
| 1170.0 | 0 |
| 1169.0 | 0 |
| 1168.0 | 0 |
| 1167.0 | 0 |
| 1166.0 | 0 |
| 1165.0 | 0 |
| 1164.0 | 0 |
| 1163.0 | 0 |
| 1162.0 | 0 |
| 1161.0 | 0 |
| 1160.0 | 0 |
| 1159.0 | 0 |
| 1158.0 | 0 |
| 1157.0 | 0 |
| 1156.0 | 0 |
| 1155.0 | 0 |
| 1154.0 | 0 |
| 1153.0 | 0 |
| 1152.0 | 0 |
| 1151.0 | 0 |
| 1150.0 | 0 |
| 1149.0 | 0 |
| 1148.0 | 0 |
| 1147.0 | 0 |
| 1146.0 | 0 |
| 1145.0 | 0 |
| 1144.0 | 0 |
| 1143.0 | 0 |
| 1142.0 | 0 |
| 1141.0 | 0 |
| 1140.0 | 0 |
| 1139.0 | 0 |
| 1138.0 | 0 |
| 1137.0 | 0 |
| 1136.0 | 0 |
| 1135.0 | 0 |
| 1134.0 | 0 |
| 1133.0 | 0 |
| 1132.0 | 0 |
| 1131.0 | 0 |
| 1130.0 | 0 |
| 1129.0 | 0 |
| 1128.0 | 0 |
| 1127.0 | 0 |
| 1126.0 | 0 |
| 1125.0 | 0 |
| 1124.0 | 0 |
| 1123.0 | 0 |
| 1122.0 | 0 |
| 1121.0 | 0 |
| 1120.0 | 0 |
| 1119.0 | 0 |
| 1118.0 | 0 |
| 1117.0 | 0 |
| 1116.0 | 0 |
| 1115.0 | 0 |
| 1114.0 | 0 |
| 1113.0 | 0 |
| 1112.0 | 0 |
| 1111.0 | 0 |
| 1110.0 | 0 |
| 1109.0 | 0 |
| 1108.0 | 0 |
| 1107.0 | 0 |
| 1106.0 | 0 |
| 1105.0 | 0 |
| 1104.0 | 0 |
| 1103.0 | 0 |
| 1102.0 | 0 |
| 1101.0 | 0 |
| 1100.0 | 0 |
| 1099.0 | 0 |
| 1098.0 | 0 |
| 1097.0 | 0 |
| 1096.0 | 0 |
| 1095.0 | 0 |
| 1094.0 | 0 |
| 1093.0 | 0 |
| 1092.0 | 0 |
| 1091.0 | 0 |
| 1090.0 | 0 |
| 1089.0 | 0 |
| 1088.0 | 0 |
| 1087.0 | 0 |
| 1086.0 | 0 |
| 1085.0 | 0 |
| 1084.0 | 0 |
| 1083.0 | 0 |
| 1082.0 | 0 |
| 1081.0 | 0 |
| 1080.0 | 0 |
| 1079.0 | 0 |
| 1078.0 | 0 |
| 1077.0 | 0 |
| 1076.0 | 0 |
| 1075.0 | 0 |
| 1074.0 | 0 |
| 1073.0 | 0 |
| 1072.0 | 0 |
| 1071.0 | 0 |
| 1070.0 | 0 |
| 1069.0 | 0 |
| 1068.0 | 0 |
| 1067.0 | 0 |
| 1066.0 | 0 |
| 1065.0 | 0 |
| 1064.0 | 0 |
| 1063.0 | 0 |
| 1062.0 | 0 |
| 1061.0 | 0 |
| 1060.0 | 0 |
| 1059.0 | 0 |
| 1058.0 | 0 |
| 1057.0 | 0 |
| 1056.0 | 0 |
| 1055.0 | 0 |
| 1054.0 | 0 |
| 1053.0 | 0 |
| 1052.0 | 0 |
| 1051.0 | 0 |
| 1050.0 | 0 |
| 1049.0 | 0 |
| 1048.0 | 0 |
| 1047.0 | 0 |
| 1046.0 | 0 |
| 1045.0 | 0 |
| 1044.0 | 0 |
| 1043.0 | 0 |
| 1042.0 | 0 |
| 1041.0 | 0 |
| 1040.0 | 0 |
| 1039.0 | 0 |
| 1038.0 | 0 |
| 1037.0 | 0 |
| 1036.0 | 0 |
| 1035.0 | 0 |
| 1034.0 | 0 |
| 1033.0 | 0 |
| 1032.0 | 0 |
| 1031.0 | 0 |
| 1030.0 | 0 |
| 1029.0 | 0 |
| 1028.0 | 0 |
| 1027.0 | 0 |
| 1026.0 | 0 |
| 1025.0 | 0 |
| 1024.0 | 0 |
| 1023.0 | 0 |
| 1022.0 | 0 |
| 1021.0 | 0 |
| 1020.0 | 0 |
| 1019.0 | 0 |
| 1018.0 | 0 |
| 1017.0 | 0 |
| 1016.0 | 0 |
| 1015.0 | 0 |
| 1014.0 | 0 |
| 1013.0 | 0 |
| 1012.0 | 0 |
| 1011.0 | 0 |
| 1010.0 | 0 |
| 1009.0 | 0 |
| 1008.0 | 0 |
| 1007.0 | 0 |
| 1006.0 | 0 |
| 1005.0 | 0 |
| 1004.0 | 0 |
| 1003.0 | 0 |
| 1002.0 | 0 |
| 1001.0 | 0 |
| 1000.0 | 0 |
| 999.0 | 0 |
| 998.0 | 0 |
| 997.0 | 0 |
| 996.0 | 0 |
| 995.0 | 0 |
| 994.0 | 0 |
| 993.0 | 0 |
| 992.0 | 0 |
| 991.0 | 0 |
| 990.0 | 0 |
| 989.0 | 0 |
| 988.0 | 0 |
| 987.0 | 0 |
| 986.0 | 0 |
| 985.0 | 0 |
| 984.0 | 0 |
| 983.0 | 0 |
| 982.0 | 0 |
| 981.0 | 0 |
| 980.0 | 0 |
| 979.0 | 0 |
| 978.0 | 0 |
| 977.0 | 0 |
| 976.0 | 0 |
| 975.0 | 0 |
| 974.0 | 0 |
| 973.0 | 0 |
| 972.0 | 0 |
| 971.0 | 0 |
| 970.0 | 0 |
| 969.0 | 0 |
| 968.0 | 0 |
| 967.0 | 0 |
| 966.0 | 0 |
| 965.0 | 0 |
| 964.0 | 0 |
| 963.0 | 0 |
| 962.0 | 0 |
| 961.0 | 0 |
| 960.0 | 0 |
| 959.0 | 0 |
| 958.0 | 0 |
| 957.0 | 0 |
| 956.0 | 0 |
| 955.0 | 0 |
| 954.0 | 0 |
| 953.0 | 0 |
| 952.0 | 0 |
| 951.0 | 0 |
| 950.0 | 0 |
| 949.0 | 0 |
| 948.0 | 0 |
| 947.0 | 0 |
| 946.0 | 0 |
| 945.0 | 0 |
| 944.0 | 0 |
| 943.0 | 0 |
| 942.0 | 0 |
| 941.0 | 0 |
| 940.0 | 0 |
| 939.0 | 0 |
| 938.0 | 0 |
| 937.0 | 0 |
| 936.0 | 0 |
| 935.0 | 0 |
| 934.0 | 0 |
| 933.0 | 0 |
| 932.0 | 0 |
| 931.0 | 0 |
| 930.0 | 0 |
| 929.0 | 0 |
| 928.0 | 0 |
| 927.0 | 0 |
| 926.0 | 0 |
| 925.0 | 0 |
| 924.0 | 0 |
| 923.0 | 0 |
| 922.0 | 0 |
| 921.0 | 0 |
| 920.0 | 0 |
| 919.0 | 0 |
| 918.0 | 0 |
| 917.0 | 0 |
| 916.0 | 0 |
| 915.0 | 0 |
| 914.0 | 0 |
| 913.0 | 0 |
| 912.0 | 0 |
| 911.0 | 0 |
| 910.0 | 0 |
| 909.0 | 0 |
| 908.0 | 0 |
| 907.0 | 0 |
| 906.0 | 0 |
| 905.0 | 0 |
| 904.0 | 0 |
| 903.0 | 0 |
| 902.0 | 0 |
| 901.0 | 0 |
| 900.0 | 0 |
| 899.0 | 0 |
| 898.0 | 0 |
| 897.0 | 0 |
| 896.0 | 0 |
| 895.0 | 0 |
| 894.0 | 0 |
| 893.0 | 0 |
| 892.0 | 0 |
| 891.0 | 0 |
| 890.0 | 0 |
| 889.0 | 0 |
| 888.0 | 0 |
| 887.0 | 0 |
| 886.0 | 0 |
| 885.0 | 0 |
| 884.0 | 0 |
| 883.0 | 0 |
| 882.0 | 0 |
| 881.0 | 0 |
| 880.0 | 0 |
| 879.0 | 0 |
| 878.0 | 0 |
| 877.0 | 0 |
| 876.0 | 0 |
| 875.0 | 0 |
| 874.0 | 0 |
| 873.0 | 0 |
| 872.0 | 0 |
| 871.0 | 0 |
| 870.0 | 0 |
| 869.0 | 0 |
| 868.0 | 0 |
| 867.0 | 0 |
| 866.0 | 0.001 |
| 865.0 | 0 |
| 864.0 | 0 |
| 863.0 | 0 |
| 862.0 | 0.001 |
| 861.0 | 0 |
| 860.0 | 0.001 |
| 859.0 | 0 |
| 858.0 | 0.001 |
| 857.0 | 0.001 |
| 856.0 | 0.001 |
| 855.0 | 0 |
| 854.0 | 0.001 |
| 853.0 | 0.001 |
| 852.0 | 0.001 |
| 851.0 | 0.001 |
| 850.0 | 0.001 |
| 849.0 | 0.001 |
| 848.0 | 0.001 |
| 847.0 | 0.001 |
| 846.0 | 0.001 |
| 845.0 | 0.001 |
| 844.0 | 0.001 |
| 843.0 | 0.001 |
| 842.0 | 0.001 |
| 841.0 | 0.001 |
| 840.0 | 0.001 |
| 839.0 | 0.001 |
| 838.0 | 0.001 |
| 837.0 | 0.001 |
| 836.0 | 0.001 |
| 835.0 | 0.001 |
| 834.0 | 0.001 |
| 833.0 | 0.001 |
| 832.0 | 0.001 |
| 831.0 | 0.001 |
| 830.0 | 0.001 |
| 829.0 | 0.001 |
| 828.0 | 0.001 |
| 827.0 | 0.001 |
| 826.0 | 0.001 |
| 825.0 | 0.001 |
| 824.0 | 0.001 |
| 823.0 | 0.002 |
| 822.0 | 0.001 |
| 821.0 | 0.001 |
| 820.0 | 0.001 |
| 819.0 | 0.002 |
| 818.0 | 0.001 |
| 817.0 | 0.001 |
| 816.0 | 0.002 |
| 815.0 | 0.002 |
| 814.0 | 0.002 |
| 813.0 | 0.001 |
| 812.0 | 0.002 |
| 811.0 | 0.002 |
| 810.0 | 0.002 |
| 809.0 | 0.002 |
| 808.0 | 0.002 |
| 807.0 | 0.002 |
| 806.0 | 0.002 |
| 805.0 | 0.002 |
| 804.0 | 0.002 |
| 803.0 | 0.002 |
| 802.0 | 0.002 |
| 801.0 | 0.002 |
| 800.0 | 0.002 |
| 799.0 | 0 |
| 798.0 | 0 |
| 797.0 | 0 |
| 796.0 | 0 |
| 795.0 | 0 |
| 794.0 | 0 |
| 793.0 | 0 |
| 792.0 | 0 |
| 791.0 | 0 |
| 790.0 | 0 |
| 789.0 | 0 |
| 788.0 | 0 |
| 787.0 | 0 |
| 786.0 | 0 |
| 785.0 | 0 |
| 784.0 | 0 |
| 783.0 | 0 |
| 782.0 | 0 |
| 781.0 | 0 |
| 780.0 | 0 |
| 779.0 | 0 |
| 778.0 | 0 |
| 777.0 | 0 |
| 776.0 | 0 |
| 775.0 | 0 |
| 774.0 | 0 |
| 773.0 | 0 |
| 772.0 | 0 |
| 771.0 | 0.001 |
| 770.0 | 0.001 |
| 769.0 | 0 |
| 768.0 | 0.001 |
| 767.0 | 0.001 |
| 766.0 | 0 |
| 765.0 | 0 |
| 764.0 | 0 |
| 763.0 | 0 |
| 762.0 | 0 |
| 761.0 | 0 |
| 760.0 | 0 |
| 759.0 | 0 |
| 758.0 | 0 |
| 757.0 | 0 |
| 756.0 | 0 |
| 755.0 | 0 |
| 754.0 | 0 |
| 753.0 | 0 |
| 752.0 | 0 |
| 751.0 | 0 |
| 750.0 | 0 |
| 749.0 | 0 |
| 748.0 | 0 |
| 747.0 | 0 |
| 746.0 | 0 |
| 745.0 | 0 |
| 744.0 | 0 |
| 743.0 | 0 |
| 742.0 | 0 |
| 741.0 | 0 |
| 740.0 | 0 |
| 739.0 | 0 |
| 738.0 | 0 |
| 737.0 | 0 |
| 736.0 | 0 |
| 735.0 | 0 |
| 734.0 | 0 |
| 733.0 | 0 |
| 732.0 | 0 |
| 731.0 | 0 |
| 730.0 | 0 |
| 729.0 | 0 |
| 728.0 | 0 |
| 727.0 | 0 |
| 726.0 | 0 |
| 725.0 | 0 |
| 724.0 | 0 |
| 723.0 | 0 |
| 722.0 | 0 |
| 721.0 | 0 |
| 720.0 | 0 |
| 719.0 | 0 |
| 718.0 | 0 |
| 717.0 | 0 |
| 716.0 | 0 |
| 715.0 | 0 |
| 714.0 | 0 |
| 713.0 | 0 |
| 712.0 | 0 |
| 711.0 | 0 |
| 710.0 | 0 |
| 709.0 | 0 |
| 708.0 | 0 |
| 707.0 | 0 |
| 706.0 | 0 |
| 705.0 | 0 |
| 704.0 | 0 |
| 703.0 | 0 |
| 702.0 | 0 |
| 701.0 | 0 |
| 700.0 | 0 |
| 699.0 | 0 |
| 698.0 | 0 |
| 697.0 | 0 |
| 696.0 | 0 |
| 695.0 | 0 |
| 694.0 | 0 |
| 693.0 | 0 |
| 692.0 | 0 |
| 691.0 | 0 |
| 690.0 | 0 |
| 689.0 | 0 |
| 688.0 | 0 |
| 687.0 | 0 |
| 686.0 | 0 |
| 685.0 | 0 |
| 684.0 | 0 |
| 683.0 | 0 |
| 682.0 | 0 |
| 681.0 | 0 |
| 680.0 | 0 |
| 679.0 | 0 |
| 678.0 | 0 |
| 677.0 | 0 |
| 676.0 | 0 |
| 675.0 | 0 |
| 674.0 | 0 |
| 673.0 | 0 |
| 672.0 | 0 |
| 671.0 | 0 |
| 670.0 | 0 |
| 669.0 | 0 |
| 668.0 | 0 |
| 667.0 | 0 |
| 666.0 | 0 |
| 665.0 | 0 |
| 664.0 | 0 |
| 663.0 | 0 |
| 662.0 | 0 |
| 661.0 | 0 |
| 660.0 | 0 |
| 659.0 | 0 |
| 658.0 | 0 |
| 657.0 | 0 |
| 656.0 | 0 |
| 655.0 | 0 |
| 654.0 | 0 |
| 653.0 | 0 |
| 652.0 | 0 |
| 651.0 | 0 |
| 650.0 | 0 |
| 649.0 | 0 |
| 648.0 | 0 |
| 647.0 | 0 |
| 646.0 | 0 |
| 645.0 | 0 |
| 644.0 | 0 |
| 643.0 | 0 |
| 642.0 | 0 |
| 641.0 | 0 |
| 640.0 | 0 |
| 639.0 | 0 |
| 638.0 | 0.001 |
| 637.0 | 0.001 |
| 636.0 | 0.001 |
| 635.0 | 0.001 |
| 634.0 | 0.002 |
| 633.0 | 0.003 |
| 632.0 | 0.003 |
| 631.0 | 0.005 |
| 630.0 | 0.007 |
| 629.0 | 0.01 |
| 628.0 | 0.014 |
| 627.0 | 0.02 |
| 626.0 | 0.03 |
| 625.0 | 0.046 |
| 624.0 | 0.072 |
| 623.0 | 0.118 |
| 622.0 | 0.2 |
| 621.0 | 0.358 |
| 620.0 | 0.67 |
| 619.0 | 1.348 |
| 618.0 | 2.897 |
| 617.0 | 6.444 |
| 616.0 | 13.048 |
| 615.0 | 24.579 |
| 614.0 | 36.489 |
| 613.0 | 45.13 |
| 612.0 | 49.431 |
| 611.0 | 50.766 |
| 610.0 | 50.541 |
| 609.0 | 50.293 |
| 608.0 | 50.775 |
| 607.0 | 48.862 |
| 606.0 | 39.425 |
| 605.0 | 24.08 |
| 604.0 | 11.152 |
| 603.0 | 4.452 |
| 602.0 | 1.875 |
| 601.0 | 0.865 |
| 600.0 | 0.437 |
| 599.0 | 0.238 |
| 598.0 | 0.138 |
| 597.0 | 0.084 |
| 596.0 | 0.053 |
| 595.0 | 0.035 |
| 594.0 | 0.024 |
| 593.0 | 0.017 |
| 592.0 | 0.012 |
| 591.0 | 0.009 |
| 590.0 | 0.006 |
| 589.0 | 0.005 |
| 588.0 | 0.004 |
| 587.0 | 0.003 |
| 586.0 | 0.002 |
| 585.0 | 0.002 |
| 584.0 | 0.001 |
| 583.0 | 0.001 |
| 582.0 | 0.001 |
| 581.0 | 0.001 |
| 580.0 | 0.001 |
| 579.0 | 0.001 |
| 578.0 | 0 |
| 577.0 | 0 |
| 576.0 | 0 |
| 575.0 | 0 |
| 574.0 | 0 |
| 573.0 | 0 |
| 572.0 | 0 |
| 571.0 | 0 |
| 570.0 | 0 |
| 569.0 | 0 |
| 568.0 | 0 |
| 567.0 | 0 |
| 566.0 | 0 |
| 565.0 | 0 |
| 564.0 | 0 |
| 563.0 | 0 |
| 562.0 | 0 |
| 561.0 | 0 |
| 560.0 | 0 |
| 559.0 | 0 |
| 558.0 | 0 |
| 557.0 | 0 |
| 556.0 | 0 |
| 555.0 | 0 |
| 554.0 | 0 |
| 553.0 | 0 |
| 552.0 | 0 |
| 551.0 | 0 |
| 550.0 | 0 |
| 549.0 | 0 |
| 548.0 | 0 |
| 547.0 | 0 |
| 546.0 | 0 |
| 545.0 | 0 |
| 544.0 | 0 |
| 543.0 | 0 |
| 542.0 | 0 |
| 541.0 | 0 |
| 540.0 | 0 |
| 539.0 | 0 |
| 538.0 | 0 |
| 537.0 | 0 |
| 536.0 | 0 |
| 535.0 | 0 |
| 534.0 | 0 |
| 533.0 | 0 |
| 532.0 | 0 |
| 531.0 | 0 |
| 530.0 | 0 |
| 529.0 | 0 |
| 528.0 | 0 |
| 527.0 | 0 |
| 526.0 | 0 |
| 525.0 | 0 |
| 524.0 | 0 |
| 523.0 | 0 |
| 522.0 | 0 |
| 521.0 | 0 |
| 520.0 | 0 |
| 519.0 | 0 |
| 518.0 | 0 |
| 517.0 | 0 |
| 516.0 | 0 |
| 515.0 | 0 |
| 514.0 | 0 |
| 513.0 | 0 |
| 512.0 | 0 |
| 511.0 | 0 |
| 510.0 | 0 |
| 509.0 | 0 |
| 508.0 | 0 |
| 507.0 | 0 |
| 506.0 | 0 |
| 505.0 | 0 |
| 504.0 | 0 |
| 503.0 | 0 |
| 502.0 | 0 |
| 501.0 | 0 |
| 500.0 | 0 |
| 499.0 | 0 |
| 498.0 | 0 |
| 497.0 | 0 |
| 496.0 | 0 |
| 495.0 | 0 |
| 494.0 | 0 |
| 493.0 | 0 |
| 492.0 | 0 |
| 491.0 | 0 |
| 490.0 | 0 |
| 489.0 | 0 |
| 488.0 | 0 |
| 487.0 | 0 |
| 486.0 | 0 |
| 485.0 | 0 |
| 484.0 | 0 |
| 483.0 | 0 |
| 482.0 | 0 |
| 481.0 | 0 |
| 480.0 | 0 |
| 479.0 | 0 |
| 478.0 | 0 |
| 477.0 | 0 |
| 476.0 | 0 |
| 475.0 | 0 |
| 474.0 | 0 |
| 473.0 | 0 |
| 472.0 | 0 |
| 471.0 | 0 |
| 470.0 | 0 |
| 469.0 | 0 |
| 468.0 | 0 |
| 467.0 | 0 |
| 466.0 | 0 |
| 465.0 | 0 |
| 464.0 | 0 |
| 463.0 | 0 |
| 462.0 | 0 |
| 461.0 | 0 |
| 460.0 | 0 |
| 459.0 | 0 |
| 458.0 | 0 |
| 457.0 | 0 |
| 456.0 | 0 |
| 455.0 | 0 |
| 454.0 | 0 |
| 453.0 | 0 |
| 452.0 | 0 |
| 451.0 | 0 |
| 450.0 | 0 |
| 449.0 | 0 |
| 448.0 | 0 |
| 447.0 | 0 |
| 446.0 | 0 |
| 445.0 | 0 |
| 444.0 | 0 |
| 443.0 | 0 |
| 442.0 | 0 |
| 441.0 | 0 |
| 440.0 | 0 |
| 439.0 | 0 |
| 438.0 | 0 |
| 437.0 | 0 |
| 436.0 | 0 |
| 435.0 | 0 |
| 434.0 | 0 |
| 433.0 | 0 |
| 432.0 | 0 |
| 431.0 | 0 |
| 430.0 | 0 |
| 429.0 | 0 |
| 428.0 | 0 |
| 427.0 | 0 |
| 426.0 | 0 |
| 425.0 | 0 |
| 424.0 | 0 |
| 423.0 | 0 |
| 422.0 | 0 |
| 421.0 | 0 |
| 420.0 | 0 |
| 419.0 | 0 |
| 418.0 | 0 |
| 417.0 | 0 |
| 416.0 | 0 |
| 415.0 | 0 |
| 414.0 | 0 |
| 413.0 | 0 |
| 412.0 | 0 |
| 411.0 | 0 |
| 410.0 | 0 |
| 409.0 | 0 |
| 408.0 | 0 |
| 407.0 | 0 |
| 406.0 | 0 |
| 405.0 | 0 |
| 404.0 | 0 |
| 403.0 | 0 |
| 402.0 | 0 |
| 401.0 | 0 |
| 400.0 | 0 |
| 399.0 | 0 |
| 398.0 | 0 |
| 397.0 | 0 |
| 396.0 | 0 |
| 395.0 | 0 |
| 394.0 | 0 |
| 393.0 | 0 |
| 392.0 | 0 |
| 391.0 | 0 |
| 390.0 | 0 |
| 389.0 | 0 |
| 388.0 | 0 |
| 387.0 | 0 |
| 386.0 | 0 |
| 385.0 | 0 |
| 384.0 | 0 |
| 383.0 | 0 |
| 382.0 | 0 |
| 381.0 | 0 |
| 380.0 | 0 |
| 379.0 | 0 |
| 378.0 | 0 |
| 377.0 | 0 |
| 376.0 | 0 |
| 375.0 | 0 |
| 374.0 | 0 |
| 373.0 | 0 |
| 372.0 | 0 |
| 371.0 | 0 |
| 370.0 | 0 |
| 369.0 | 0 |
| 368.0 | 0 |
| 367.0 | 0 |
| 366.0 | 0 |
| 365.0 | 0 |
| 364.0 | 0 |
| 363.0 | 0 |
| 362.0 | 0 |
| 361.0 | 0 |
| 360.0 | 0 |
| 359.0 | 0 |
| 358.0 | 0 |
| 357.0 | 0 |
| 356.0 | 0 |
| 355.0 | 0 |
| 354.0 | 0 |
| 353.0 | 0 |
| 352.0 | 0 |
| 351.0 | 0 |
| 350.0 | 0 |
| 349.0 | 0 |
| 348.0 | 0 |
| 347.0 | 0 |
| 346.0 | 0 |
| 345.0 | 0 |
| 344.0 | 0 |
| 343.0 | 0 |
| 342.0 | 0 |
| 341.0 | 0 |
| 340.0 | 0 |
| 339.0 | 0 |
| 338.0 | 0 |
| 337.0 | 0 |
| 336.0 | 0 |
| 335.0 | 0 |
| 334.0 | 0 |
| 333.0 | 0 |
| 332.0 | 0 |
| 331.0 | 0 |
| 330.0 | 0 |
| 329.0 | 0 |
| 328.0 | 0 |
| 327.0 | 0 |
| 326.0 | 0 |
| 325.0 | 0 |
| 324.0 | 0 |
| 323.0 | 0 |
| 322.0 | 0 |
| 321.0 | 0 |
| 320.0 | 0 |
| 319.0 | 0 |
| 318.0 | 0 |
| 317.0 | 0 |
| 316.0 | 0 |
| 315.0 | 0 |
| 314.0 | 0 |
| 313.0 | 0 |
| 312.0 | 0 |
| 311.0 | 0 |
| 310.0 | 0 |
| 309.0 | 0 |
| 308.0 | 0 |
| 307.0 | 0 |
| 306.0 | 0 |
| 305.0 | 0 |
| 304.0 | 0 |
| 303.0 | 0 |
| 302.0 | 0 |
| 301.0 | 0 |
| 300.0 | 0 |
| 299.0 | 0 |
| 298.0 | 0 |
| 297.0 | 0 |
| 296.0 | 0 |
| 295.0 | 0 |
| 294.0 | 0 |
| 293.0 | 0 |
| 292.0 | 0 |
| 291.0 | 0 |
| 290.0 | 0 |
| 289.0 | 0 |
| 288.0 | 0 |
| 287.0 | 0 |
| 286.0 | 0 |
| 285.0 | 0 |
| 284.0 | 0 |
| 283.0 | 0 |
| 282.0 | 0 |
| 281.0 | 0 |
| 280.0 | 0 |
| 279.0 | 0 |
| 278.0 | 0 |
| 277.0 | 0 |
| 276.0 | 0 |
| 275.0 | 0 |
| 274.0 | 0 |
| 273.0 | 0 |
| 272.0 | 0 |
| 271.0 | 0 |
| 270.0 | 0 |
| 269.0 | 0 |
| 268.0 | 0 |
| 267.0 | 0 |
| 266.0 | 0 |
| 265.0 | 0 |
| 264.0 | 0 |
| 263.0 | 0 |
| 262.0 | 0 |
| 261.0 | 0 |
| 260.0 | 0 |
| 259.0 | 0 |
| 258.0 | 0 |
| 257.0 | 0 |
| 256.0 | 0 |
| 255.0 | 0 |
| 254.0 | 0 |
| 253.0 | 0 |
| 252.0 | 0 |
| 251.0 | 0 |
| 250.0 | 0 |
| 249.0 | 0 |
| 248.0 | 0 |
| 247.0 | 0 |
| 246.0 | 0 |
| 245.0 | 0 |
| 244.0 | 0 |
| 243.0 | 0 |
| 242.0 | 0 |
| 241.0 | 0 |
| 240.0 | 0 |
| 239.0 | 0 |
| 238.0 | 0 |
| 237.0 | 0 |
| 236.0 | 0 |
| 235.0 | 0 |
| 234.0 | 0 |
| 233.0 | 0 |
| 232.0 | 0 |
| 231.0 | 0 |
| 230.0 | 0 |
| 229.0 | 0 |
| 228.0 | 0 |
| 227.0 | 0 |
| 226.0 | 0 |
| 225.0 | 0 |
| 224.0 | 0 |
| 223.0 | 0 |
| 222.0 | 0 |
| 221.0 | 0 |
| 220.0 | 0 |
| 219.0 | 0 |
| 218.0 | 0 |
| 217.0 | 0 |
| 216.0 | 0 |
| 215.0 | 0 |
| 214.0 | 0 |
| 213.0 | 0 |
| 212.0 | 0 |
| 211.0 | 0 |
| 210.0 | 0 |
| 209.0 | 0 |
| 208.0 | 0 |
| 207.0 | 0 |
| 206.0 | 0 |
| 205.0 | 0 |
| 204.0 | 0 |
| 203.0 | 0 |
| 202.0 | 0 |
| 201.0 | 0 |